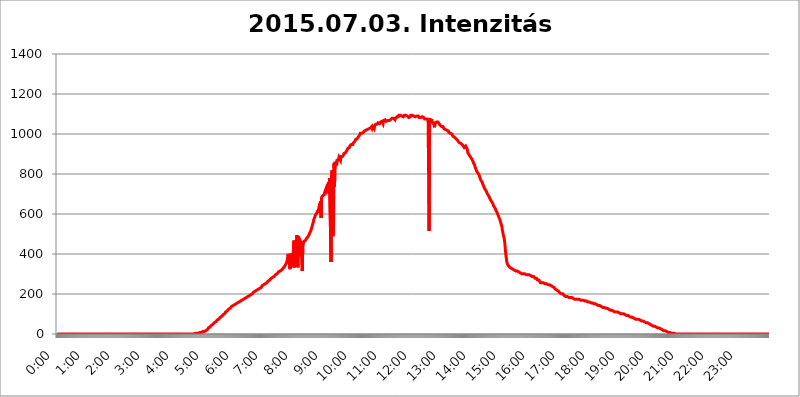
| Category | 2015.07.03. Intenzitás [W/m^2] |
|---|---|
| 0.0 | 0 |
| 0.0006944444444444445 | 0 |
| 0.001388888888888889 | 0 |
| 0.0020833333333333333 | 0 |
| 0.002777777777777778 | 0 |
| 0.003472222222222222 | 0 |
| 0.004166666666666667 | 0 |
| 0.004861111111111111 | 0 |
| 0.005555555555555556 | 0 |
| 0.0062499999999999995 | 0 |
| 0.006944444444444444 | 0 |
| 0.007638888888888889 | 0 |
| 0.008333333333333333 | 0 |
| 0.009027777777777779 | 0 |
| 0.009722222222222222 | 0 |
| 0.010416666666666666 | 0 |
| 0.011111111111111112 | 0 |
| 0.011805555555555555 | 0 |
| 0.012499999999999999 | 0 |
| 0.013194444444444444 | 0 |
| 0.013888888888888888 | 0 |
| 0.014583333333333332 | 0 |
| 0.015277777777777777 | 0 |
| 0.015972222222222224 | 0 |
| 0.016666666666666666 | 0 |
| 0.017361111111111112 | 0 |
| 0.018055555555555557 | 0 |
| 0.01875 | 0 |
| 0.019444444444444445 | 0 |
| 0.02013888888888889 | 0 |
| 0.020833333333333332 | 0 |
| 0.02152777777777778 | 0 |
| 0.022222222222222223 | 0 |
| 0.02291666666666667 | 0 |
| 0.02361111111111111 | 0 |
| 0.024305555555555556 | 0 |
| 0.024999999999999998 | 0 |
| 0.025694444444444447 | 0 |
| 0.02638888888888889 | 0 |
| 0.027083333333333334 | 0 |
| 0.027777777777777776 | 0 |
| 0.02847222222222222 | 0 |
| 0.029166666666666664 | 0 |
| 0.029861111111111113 | 0 |
| 0.030555555555555555 | 0 |
| 0.03125 | 0 |
| 0.03194444444444445 | 0 |
| 0.03263888888888889 | 0 |
| 0.03333333333333333 | 0 |
| 0.034027777777777775 | 0 |
| 0.034722222222222224 | 0 |
| 0.035416666666666666 | 0 |
| 0.036111111111111115 | 0 |
| 0.03680555555555556 | 0 |
| 0.0375 | 0 |
| 0.03819444444444444 | 0 |
| 0.03888888888888889 | 0 |
| 0.03958333333333333 | 0 |
| 0.04027777777777778 | 0 |
| 0.04097222222222222 | 0 |
| 0.041666666666666664 | 0 |
| 0.042361111111111106 | 0 |
| 0.04305555555555556 | 0 |
| 0.043750000000000004 | 0 |
| 0.044444444444444446 | 0 |
| 0.04513888888888889 | 0 |
| 0.04583333333333334 | 0 |
| 0.04652777777777778 | 0 |
| 0.04722222222222222 | 0 |
| 0.04791666666666666 | 0 |
| 0.04861111111111111 | 0 |
| 0.049305555555555554 | 0 |
| 0.049999999999999996 | 0 |
| 0.05069444444444445 | 0 |
| 0.051388888888888894 | 0 |
| 0.052083333333333336 | 0 |
| 0.05277777777777778 | 0 |
| 0.05347222222222222 | 0 |
| 0.05416666666666667 | 0 |
| 0.05486111111111111 | 0 |
| 0.05555555555555555 | 0 |
| 0.05625 | 0 |
| 0.05694444444444444 | 0 |
| 0.057638888888888885 | 0 |
| 0.05833333333333333 | 0 |
| 0.05902777777777778 | 0 |
| 0.059722222222222225 | 0 |
| 0.06041666666666667 | 0 |
| 0.061111111111111116 | 0 |
| 0.06180555555555556 | 0 |
| 0.0625 | 0 |
| 0.06319444444444444 | 0 |
| 0.06388888888888888 | 0 |
| 0.06458333333333334 | 0 |
| 0.06527777777777778 | 0 |
| 0.06597222222222222 | 0 |
| 0.06666666666666667 | 0 |
| 0.06736111111111111 | 0 |
| 0.06805555555555555 | 0 |
| 0.06874999999999999 | 0 |
| 0.06944444444444443 | 0 |
| 0.07013888888888889 | 0 |
| 0.07083333333333333 | 0 |
| 0.07152777777777779 | 0 |
| 0.07222222222222223 | 0 |
| 0.07291666666666667 | 0 |
| 0.07361111111111111 | 0 |
| 0.07430555555555556 | 0 |
| 0.075 | 0 |
| 0.07569444444444444 | 0 |
| 0.0763888888888889 | 0 |
| 0.07708333333333334 | 0 |
| 0.07777777777777778 | 0 |
| 0.07847222222222222 | 0 |
| 0.07916666666666666 | 0 |
| 0.0798611111111111 | 0 |
| 0.08055555555555556 | 0 |
| 0.08125 | 0 |
| 0.08194444444444444 | 0 |
| 0.08263888888888889 | 0 |
| 0.08333333333333333 | 0 |
| 0.08402777777777777 | 0 |
| 0.08472222222222221 | 0 |
| 0.08541666666666665 | 0 |
| 0.08611111111111112 | 0 |
| 0.08680555555555557 | 0 |
| 0.08750000000000001 | 0 |
| 0.08819444444444445 | 0 |
| 0.08888888888888889 | 0 |
| 0.08958333333333333 | 0 |
| 0.09027777777777778 | 0 |
| 0.09097222222222222 | 0 |
| 0.09166666666666667 | 0 |
| 0.09236111111111112 | 0 |
| 0.09305555555555556 | 0 |
| 0.09375 | 0 |
| 0.09444444444444444 | 0 |
| 0.09513888888888888 | 0 |
| 0.09583333333333333 | 0 |
| 0.09652777777777777 | 0 |
| 0.09722222222222222 | 0 |
| 0.09791666666666667 | 0 |
| 0.09861111111111111 | 0 |
| 0.09930555555555555 | 0 |
| 0.09999999999999999 | 0 |
| 0.10069444444444443 | 0 |
| 0.1013888888888889 | 0 |
| 0.10208333333333335 | 0 |
| 0.10277777777777779 | 0 |
| 0.10347222222222223 | 0 |
| 0.10416666666666667 | 0 |
| 0.10486111111111111 | 0 |
| 0.10555555555555556 | 0 |
| 0.10625 | 0 |
| 0.10694444444444444 | 0 |
| 0.1076388888888889 | 0 |
| 0.10833333333333334 | 0 |
| 0.10902777777777778 | 0 |
| 0.10972222222222222 | 0 |
| 0.1111111111111111 | 0 |
| 0.11180555555555556 | 0 |
| 0.11180555555555556 | 0 |
| 0.1125 | 0 |
| 0.11319444444444444 | 0 |
| 0.11388888888888889 | 0 |
| 0.11458333333333333 | 0 |
| 0.11527777777777777 | 0 |
| 0.11597222222222221 | 0 |
| 0.11666666666666665 | 0 |
| 0.1173611111111111 | 0 |
| 0.11805555555555557 | 0 |
| 0.11944444444444445 | 0 |
| 0.12013888888888889 | 0 |
| 0.12083333333333333 | 0 |
| 0.12152777777777778 | 0 |
| 0.12222222222222223 | 0 |
| 0.12291666666666667 | 0 |
| 0.12291666666666667 | 0 |
| 0.12361111111111112 | 0 |
| 0.12430555555555556 | 0 |
| 0.125 | 0 |
| 0.12569444444444444 | 0 |
| 0.12638888888888888 | 0 |
| 0.12708333333333333 | 0 |
| 0.16875 | 0 |
| 0.12847222222222224 | 0 |
| 0.12916666666666668 | 0 |
| 0.12986111111111112 | 0 |
| 0.13055555555555556 | 0 |
| 0.13125 | 0 |
| 0.13194444444444445 | 0 |
| 0.1326388888888889 | 0 |
| 0.13333333333333333 | 0 |
| 0.13402777777777777 | 0 |
| 0.13402777777777777 | 0 |
| 0.13472222222222222 | 0 |
| 0.13541666666666666 | 0 |
| 0.1361111111111111 | 0 |
| 0.13749999999999998 | 0 |
| 0.13819444444444443 | 0 |
| 0.1388888888888889 | 0 |
| 0.13958333333333334 | 0 |
| 0.14027777777777778 | 0 |
| 0.14097222222222222 | 0 |
| 0.14166666666666666 | 0 |
| 0.1423611111111111 | 0 |
| 0.14305555555555557 | 0 |
| 0.14375000000000002 | 0 |
| 0.14444444444444446 | 0 |
| 0.1451388888888889 | 0 |
| 0.1451388888888889 | 0 |
| 0.14652777777777778 | 0 |
| 0.14722222222222223 | 0 |
| 0.14791666666666667 | 0 |
| 0.1486111111111111 | 0 |
| 0.14930555555555555 | 0 |
| 0.15 | 0 |
| 0.15069444444444444 | 0 |
| 0.15138888888888888 | 0 |
| 0.15208333333333332 | 0 |
| 0.15277777777777776 | 0 |
| 0.15347222222222223 | 0 |
| 0.15416666666666667 | 0 |
| 0.15486111111111112 | 0 |
| 0.15555555555555556 | 0 |
| 0.15625 | 0 |
| 0.15694444444444444 | 0 |
| 0.15763888888888888 | 0 |
| 0.15833333333333333 | 0 |
| 0.15902777777777777 | 0 |
| 0.15972222222222224 | 0 |
| 0.16041666666666668 | 0 |
| 0.16111111111111112 | 0 |
| 0.16180555555555556 | 0 |
| 0.1625 | 0 |
| 0.16319444444444445 | 0 |
| 0.1638888888888889 | 0 |
| 0.16458333333333333 | 0 |
| 0.16527777777777777 | 0 |
| 0.16597222222222222 | 0 |
| 0.16666666666666666 | 0 |
| 0.1673611111111111 | 0 |
| 0.16805555555555554 | 0 |
| 0.16874999999999998 | 0 |
| 0.16944444444444443 | 0 |
| 0.17013888888888887 | 0 |
| 0.1708333333333333 | 0 |
| 0.17152777777777775 | 0 |
| 0.17222222222222225 | 0 |
| 0.1729166666666667 | 0 |
| 0.17361111111111113 | 0 |
| 0.17430555555555557 | 0 |
| 0.17500000000000002 | 0 |
| 0.17569444444444446 | 0 |
| 0.1763888888888889 | 0 |
| 0.17708333333333334 | 0 |
| 0.17777777777777778 | 0 |
| 0.17847222222222223 | 0 |
| 0.17916666666666667 | 0 |
| 0.1798611111111111 | 0 |
| 0.18055555555555555 | 0 |
| 0.18125 | 0 |
| 0.18194444444444444 | 0 |
| 0.1826388888888889 | 0 |
| 0.18333333333333335 | 0 |
| 0.1840277777777778 | 0 |
| 0.18472222222222223 | 0 |
| 0.18541666666666667 | 0 |
| 0.18611111111111112 | 0 |
| 0.18680555555555556 | 0 |
| 0.1875 | 0 |
| 0.18819444444444444 | 0 |
| 0.18888888888888888 | 0 |
| 0.18958333333333333 | 0 |
| 0.19027777777777777 | 0 |
| 0.1909722222222222 | 0 |
| 0.19166666666666665 | 0 |
| 0.19236111111111112 | 0 |
| 0.19305555555555554 | 0 |
| 0.19375 | 3.525 |
| 0.19444444444444445 | 3.525 |
| 0.1951388888888889 | 3.525 |
| 0.19583333333333333 | 3.525 |
| 0.19652777777777777 | 3.525 |
| 0.19722222222222222 | 3.525 |
| 0.19791666666666666 | 3.525 |
| 0.1986111111111111 | 3.525 |
| 0.19930555555555554 | 7.887 |
| 0.19999999999999998 | 7.887 |
| 0.20069444444444443 | 7.887 |
| 0.20138888888888887 | 7.887 |
| 0.2020833333333333 | 7.887 |
| 0.2027777777777778 | 7.887 |
| 0.2034722222222222 | 12.257 |
| 0.2041666666666667 | 12.257 |
| 0.20486111111111113 | 12.257 |
| 0.20555555555555557 | 12.257 |
| 0.20625000000000002 | 12.257 |
| 0.20694444444444446 | 16.636 |
| 0.2076388888888889 | 16.636 |
| 0.20833333333333334 | 16.636 |
| 0.20902777777777778 | 21.024 |
| 0.20972222222222223 | 21.024 |
| 0.21041666666666667 | 21.024 |
| 0.2111111111111111 | 25.419 |
| 0.21180555555555555 | 29.823 |
| 0.2125 | 29.823 |
| 0.21319444444444444 | 34.234 |
| 0.2138888888888889 | 34.234 |
| 0.21458333333333335 | 38.653 |
| 0.2152777777777778 | 38.653 |
| 0.21597222222222223 | 43.079 |
| 0.21666666666666667 | 43.079 |
| 0.21736111111111112 | 47.511 |
| 0.21805555555555556 | 47.511 |
| 0.21875 | 51.951 |
| 0.21944444444444444 | 51.951 |
| 0.22013888888888888 | 56.398 |
| 0.22083333333333333 | 56.398 |
| 0.22152777777777777 | 60.85 |
| 0.2222222222222222 | 60.85 |
| 0.22291666666666665 | 65.31 |
| 0.2236111111111111 | 65.31 |
| 0.22430555555555556 | 69.775 |
| 0.225 | 69.775 |
| 0.22569444444444445 | 74.246 |
| 0.2263888888888889 | 74.246 |
| 0.22708333333333333 | 78.722 |
| 0.22777777777777777 | 78.722 |
| 0.22847222222222222 | 83.205 |
| 0.22916666666666666 | 83.205 |
| 0.2298611111111111 | 87.692 |
| 0.23055555555555554 | 87.692 |
| 0.23124999999999998 | 92.184 |
| 0.23194444444444443 | 92.184 |
| 0.23263888888888887 | 96.682 |
| 0.2333333333333333 | 96.682 |
| 0.2340277777777778 | 101.184 |
| 0.2347222222222222 | 101.184 |
| 0.2354166666666667 | 105.69 |
| 0.23611111111111113 | 110.201 |
| 0.23680555555555557 | 110.201 |
| 0.23750000000000002 | 110.201 |
| 0.23819444444444446 | 114.716 |
| 0.2388888888888889 | 119.235 |
| 0.23958333333333334 | 119.235 |
| 0.24027777777777778 | 123.758 |
| 0.24097222222222223 | 123.758 |
| 0.24166666666666667 | 128.284 |
| 0.2423611111111111 | 128.284 |
| 0.24305555555555555 | 132.814 |
| 0.24375 | 132.814 |
| 0.24444444444444446 | 137.347 |
| 0.24513888888888888 | 137.347 |
| 0.24583333333333335 | 137.347 |
| 0.2465277777777778 | 141.884 |
| 0.24722222222222223 | 141.884 |
| 0.24791666666666667 | 141.884 |
| 0.24861111111111112 | 146.423 |
| 0.24930555555555556 | 146.423 |
| 0.25 | 150.964 |
| 0.25069444444444444 | 150.964 |
| 0.2513888888888889 | 155.509 |
| 0.2520833333333333 | 155.509 |
| 0.25277777777777777 | 155.509 |
| 0.2534722222222222 | 155.509 |
| 0.25416666666666665 | 160.056 |
| 0.2548611111111111 | 160.056 |
| 0.2555555555555556 | 164.605 |
| 0.25625000000000003 | 164.605 |
| 0.2569444444444445 | 164.605 |
| 0.2576388888888889 | 169.156 |
| 0.25833333333333336 | 169.156 |
| 0.2590277777777778 | 169.156 |
| 0.25972222222222224 | 173.709 |
| 0.2604166666666667 | 173.709 |
| 0.2611111111111111 | 173.709 |
| 0.26180555555555557 | 173.709 |
| 0.2625 | 178.264 |
| 0.26319444444444445 | 178.264 |
| 0.2638888888888889 | 178.264 |
| 0.26458333333333334 | 182.82 |
| 0.2652777777777778 | 182.82 |
| 0.2659722222222222 | 182.82 |
| 0.26666666666666666 | 187.378 |
| 0.2673611111111111 | 187.378 |
| 0.26805555555555555 | 191.937 |
| 0.26875 | 191.937 |
| 0.26944444444444443 | 191.937 |
| 0.2701388888888889 | 191.937 |
| 0.2708333333333333 | 196.497 |
| 0.27152777777777776 | 196.497 |
| 0.2722222222222222 | 201.058 |
| 0.27291666666666664 | 201.058 |
| 0.2736111111111111 | 201.058 |
| 0.2743055555555555 | 205.62 |
| 0.27499999999999997 | 205.62 |
| 0.27569444444444446 | 210.182 |
| 0.27638888888888885 | 210.182 |
| 0.27708333333333335 | 210.182 |
| 0.2777777777777778 | 214.746 |
| 0.27847222222222223 | 214.746 |
| 0.2791666666666667 | 219.309 |
| 0.2798611111111111 | 219.309 |
| 0.28055555555555556 | 219.309 |
| 0.28125 | 219.309 |
| 0.28194444444444444 | 223.873 |
| 0.2826388888888889 | 228.436 |
| 0.2833333333333333 | 228.436 |
| 0.28402777777777777 | 228.436 |
| 0.2847222222222222 | 228.436 |
| 0.28541666666666665 | 233 |
| 0.28611111111111115 | 233 |
| 0.28680555555555554 | 237.564 |
| 0.28750000000000003 | 242.127 |
| 0.2881944444444445 | 242.127 |
| 0.2888888888888889 | 242.127 |
| 0.28958333333333336 | 246.689 |
| 0.2902777777777778 | 246.689 |
| 0.29097222222222224 | 246.689 |
| 0.2916666666666667 | 251.251 |
| 0.2923611111111111 | 251.251 |
| 0.29305555555555557 | 255.813 |
| 0.29375 | 255.813 |
| 0.29444444444444445 | 260.373 |
| 0.2951388888888889 | 260.373 |
| 0.29583333333333334 | 264.932 |
| 0.2965277777777778 | 264.932 |
| 0.2972222222222222 | 269.49 |
| 0.29791666666666666 | 269.49 |
| 0.2986111111111111 | 269.49 |
| 0.29930555555555555 | 274.047 |
| 0.3 | 278.603 |
| 0.30069444444444443 | 278.603 |
| 0.3013888888888889 | 278.603 |
| 0.3020833333333333 | 283.156 |
| 0.30277777777777776 | 283.156 |
| 0.3034722222222222 | 287.709 |
| 0.30416666666666664 | 287.709 |
| 0.3048611111111111 | 292.259 |
| 0.3055555555555555 | 292.259 |
| 0.30624999999999997 | 296.808 |
| 0.3069444444444444 | 296.808 |
| 0.3076388888888889 | 301.354 |
| 0.30833333333333335 | 301.354 |
| 0.3090277777777778 | 305.898 |
| 0.30972222222222223 | 305.898 |
| 0.3104166666666667 | 310.44 |
| 0.3111111111111111 | 310.44 |
| 0.31180555555555556 | 314.98 |
| 0.3125 | 314.98 |
| 0.31319444444444444 | 314.98 |
| 0.3138888888888889 | 319.517 |
| 0.3145833333333333 | 319.517 |
| 0.31527777777777777 | 324.052 |
| 0.3159722222222222 | 324.052 |
| 0.31666666666666665 | 328.584 |
| 0.31736111111111115 | 328.584 |
| 0.31805555555555554 | 333.113 |
| 0.31875000000000003 | 337.639 |
| 0.3194444444444445 | 342.162 |
| 0.3201388888888889 | 346.682 |
| 0.32083333333333336 | 351.198 |
| 0.3215277777777778 | 355.712 |
| 0.32222222222222224 | 360.221 |
| 0.3229166666666667 | 373.729 |
| 0.3236111111111111 | 400.638 |
| 0.32430555555555557 | 396.164 |
| 0.325 | 387.202 |
| 0.32569444444444445 | 346.682 |
| 0.3263888888888889 | 324.052 |
| 0.32708333333333334 | 369.23 |
| 0.3277777777777778 | 333.113 |
| 0.3284722222222222 | 405.108 |
| 0.32916666666666666 | 355.712 |
| 0.3298611111111111 | 342.162 |
| 0.33055555555555555 | 373.729 |
| 0.33125 | 422.943 |
| 0.33194444444444443 | 467.187 |
| 0.3326388888888889 | 333.113 |
| 0.3333333333333333 | 333.113 |
| 0.3340277777777778 | 373.729 |
| 0.3347222222222222 | 351.198 |
| 0.3354166666666667 | 342.162 |
| 0.3361111111111111 | 493.475 |
| 0.3368055555555556 | 427.39 |
| 0.33749999999999997 | 333.113 |
| 0.33819444444444446 | 489.108 |
| 0.33888888888888885 | 391.685 |
| 0.33958333333333335 | 480.356 |
| 0.34027777777777773 | 475.972 |
| 0.34097222222222223 | 475.972 |
| 0.3416666666666666 | 445.129 |
| 0.3423611111111111 | 458.38 |
| 0.3430555555555555 | 458.38 |
| 0.34375 | 314.98 |
| 0.3444444444444445 | 462.786 |
| 0.3451388888888889 | 453.968 |
| 0.3458333333333334 | 462.786 |
| 0.34652777777777777 | 462.786 |
| 0.34722222222222227 | 467.187 |
| 0.34791666666666665 | 467.187 |
| 0.34861111111111115 | 471.582 |
| 0.34930555555555554 | 475.972 |
| 0.35000000000000003 | 475.972 |
| 0.3506944444444444 | 475.972 |
| 0.3513888888888889 | 484.735 |
| 0.3520833333333333 | 484.735 |
| 0.3527777777777778 | 493.475 |
| 0.3534722222222222 | 497.836 |
| 0.3541666666666667 | 506.542 |
| 0.3548611111111111 | 510.885 |
| 0.35555555555555557 | 515.223 |
| 0.35625 | 523.88 |
| 0.35694444444444445 | 532.513 |
| 0.3576388888888889 | 541.121 |
| 0.35833333333333334 | 549.704 |
| 0.3590277777777778 | 558.261 |
| 0.3597222222222222 | 571.049 |
| 0.36041666666666666 | 575.299 |
| 0.3611111111111111 | 583.779 |
| 0.36180555555555555 | 592.233 |
| 0.3625 | 592.233 |
| 0.36319444444444443 | 600.661 |
| 0.3638888888888889 | 600.661 |
| 0.3645833333333333 | 609.062 |
| 0.3652777777777778 | 617.436 |
| 0.3659722222222222 | 604.864 |
| 0.3666666666666667 | 625.784 |
| 0.3673611111111111 | 638.256 |
| 0.3680555555555556 | 650.667 |
| 0.36874999999999997 | 650.667 |
| 0.36944444444444446 | 663.019 |
| 0.37013888888888885 | 579.542 |
| 0.37083333333333335 | 683.473 |
| 0.37152777777777773 | 687.544 |
| 0.37222222222222223 | 691.608 |
| 0.3729166666666666 | 695.666 |
| 0.3736111111111111 | 695.666 |
| 0.3743055555555555 | 695.666 |
| 0.375 | 707.8 |
| 0.3756944444444445 | 703.762 |
| 0.3763888888888889 | 711.832 |
| 0.3770833333333334 | 727.896 |
| 0.37777777777777777 | 719.877 |
| 0.37847222222222227 | 715.858 |
| 0.37916666666666665 | 719.877 |
| 0.37986111111111115 | 751.803 |
| 0.38055555555555554 | 759.723 |
| 0.38125000000000003 | 703.762 |
| 0.3819444444444444 | 779.42 |
| 0.3826388888888889 | 775.492 |
| 0.3833333333333333 | 783.342 |
| 0.3840277777777778 | 360.221 |
| 0.3847222222222222 | 795.074 |
| 0.3854166666666667 | 818.392 |
| 0.3861111111111111 | 743.859 |
| 0.38680555555555557 | 489.108 |
| 0.3875 | 532.513 |
| 0.38819444444444445 | 853.029 |
| 0.3888888888888889 | 735.89 |
| 0.38958333333333334 | 860.676 |
| 0.3902777777777778 | 860.676 |
| 0.3909722222222222 | 860.676 |
| 0.39166666666666666 | 841.526 |
| 0.3923611111111111 | 868.305 |
| 0.39305555555555555 | 872.114 |
| 0.39375 | 868.305 |
| 0.39444444444444443 | 872.114 |
| 0.3951388888888889 | 883.516 |
| 0.3958333333333333 | 883.516 |
| 0.3965277777777778 | 879.719 |
| 0.3972222222222222 | 868.305 |
| 0.3979166666666667 | 887.309 |
| 0.3986111111111111 | 887.309 |
| 0.3993055555555556 | 891.099 |
| 0.39999999999999997 | 887.309 |
| 0.40069444444444446 | 887.309 |
| 0.40138888888888885 | 894.885 |
| 0.40208333333333335 | 902.447 |
| 0.40277777777777773 | 898.668 |
| 0.40347222222222223 | 902.447 |
| 0.4041666666666666 | 906.223 |
| 0.4048611111111111 | 902.447 |
| 0.4055555555555555 | 909.996 |
| 0.40625 | 917.534 |
| 0.4069444444444445 | 921.298 |
| 0.4076388888888889 | 928.819 |
| 0.4083333333333334 | 928.819 |
| 0.40902777777777777 | 928.819 |
| 0.40972222222222227 | 932.576 |
| 0.41041666666666665 | 940.082 |
| 0.41111111111111115 | 940.082 |
| 0.41180555555555554 | 940.082 |
| 0.41250000000000003 | 947.58 |
| 0.4131944444444444 | 947.58 |
| 0.4138888888888889 | 951.327 |
| 0.4145833333333333 | 947.58 |
| 0.4152777777777778 | 955.071 |
| 0.4159722222222222 | 958.814 |
| 0.4166666666666667 | 958.814 |
| 0.4173611111111111 | 962.555 |
| 0.41805555555555557 | 962.555 |
| 0.41875 | 973.772 |
| 0.41944444444444445 | 970.034 |
| 0.4201388888888889 | 977.508 |
| 0.42083333333333334 | 977.508 |
| 0.4215277777777778 | 981.244 |
| 0.4222222222222222 | 984.98 |
| 0.42291666666666666 | 988.714 |
| 0.4236111111111111 | 988.714 |
| 0.42430555555555555 | 996.182 |
| 0.425 | 1003.65 |
| 0.42569444444444443 | 1003.65 |
| 0.4263888888888889 | 1003.65 |
| 0.4270833333333333 | 1003.65 |
| 0.4277777777777778 | 1007.383 |
| 0.4284722222222222 | 1007.383 |
| 0.4291666666666667 | 1007.383 |
| 0.4298611111111111 | 1011.118 |
| 0.4305555555555556 | 1014.852 |
| 0.43124999999999997 | 1014.852 |
| 0.43194444444444446 | 1014.852 |
| 0.43263888888888885 | 1018.587 |
| 0.43333333333333335 | 1018.587 |
| 0.43402777777777773 | 1022.323 |
| 0.43472222222222223 | 1022.323 |
| 0.4354166666666666 | 1022.323 |
| 0.4361111111111111 | 1026.06 |
| 0.4368055555555555 | 1026.06 |
| 0.4375 | 1026.06 |
| 0.4381944444444445 | 1029.798 |
| 0.4388888888888889 | 1029.798 |
| 0.4395833333333334 | 1029.798 |
| 0.44027777777777777 | 1026.06 |
| 0.44097222222222227 | 1037.277 |
| 0.44166666666666665 | 1029.798 |
| 0.44236111111111115 | 1037.277 |
| 0.44305555555555554 | 1037.277 |
| 0.44375000000000003 | 1041.019 |
| 0.4444444444444444 | 1026.06 |
| 0.4451388888888889 | 1041.019 |
| 0.4458333333333333 | 1044.762 |
| 0.4465277777777778 | 1048.508 |
| 0.4472222222222222 | 1048.508 |
| 0.4479166666666667 | 1052.255 |
| 0.4486111111111111 | 1048.508 |
| 0.44930555555555557 | 1052.255 |
| 0.45 | 1056.004 |
| 0.45069444444444445 | 1052.255 |
| 0.4513888888888889 | 1059.756 |
| 0.45208333333333334 | 1052.255 |
| 0.4527777777777778 | 1052.255 |
| 0.4534722222222222 | 1059.756 |
| 0.45416666666666666 | 1059.756 |
| 0.4548611111111111 | 1063.51 |
| 0.45555555555555555 | 1063.51 |
| 0.45625 | 1063.51 |
| 0.45694444444444443 | 1052.255 |
| 0.4576388888888889 | 1067.267 |
| 0.4583333333333333 | 1067.267 |
| 0.4590277777777778 | 1071.027 |
| 0.4597222222222222 | 1071.027 |
| 0.4604166666666667 | 1071.027 |
| 0.4611111111111111 | 1063.51 |
| 0.4618055555555556 | 1067.267 |
| 0.46249999999999997 | 1067.267 |
| 0.46319444444444446 | 1067.267 |
| 0.46388888888888885 | 1063.51 |
| 0.46458333333333335 | 1067.267 |
| 0.46527777777777773 | 1067.267 |
| 0.46597222222222223 | 1067.267 |
| 0.4666666666666666 | 1067.267 |
| 0.4673611111111111 | 1071.027 |
| 0.4680555555555555 | 1074.789 |
| 0.46875 | 1067.267 |
| 0.4694444444444445 | 1078.555 |
| 0.4701388888888889 | 1078.555 |
| 0.4708333333333334 | 1078.555 |
| 0.47152777777777777 | 1078.555 |
| 0.47222222222222227 | 1078.555 |
| 0.47291666666666665 | 1082.324 |
| 0.47361111111111115 | 1071.027 |
| 0.47430555555555554 | 1078.555 |
| 0.47500000000000003 | 1082.324 |
| 0.4756944444444444 | 1082.324 |
| 0.4763888888888889 | 1086.097 |
| 0.4770833333333333 | 1086.097 |
| 0.4777777777777778 | 1086.097 |
| 0.4784722222222222 | 1086.097 |
| 0.4791666666666667 | 1093.653 |
| 0.4798611111111111 | 1093.653 |
| 0.48055555555555557 | 1093.653 |
| 0.48125 | 1093.653 |
| 0.48194444444444445 | 1093.653 |
| 0.4826388888888889 | 1093.653 |
| 0.48333333333333334 | 1089.873 |
| 0.4840277777777778 | 1086.097 |
| 0.4847222222222222 | 1086.097 |
| 0.48541666666666666 | 1086.097 |
| 0.4861111111111111 | 1086.097 |
| 0.48680555555555555 | 1093.653 |
| 0.4875 | 1093.653 |
| 0.48819444444444443 | 1097.437 |
| 0.4888888888888889 | 1093.653 |
| 0.4895833333333333 | 1093.653 |
| 0.4902777777777778 | 1093.653 |
| 0.4909722222222222 | 1089.873 |
| 0.4916666666666667 | 1089.873 |
| 0.4923611111111111 | 1086.097 |
| 0.4930555555555556 | 1082.324 |
| 0.49374999999999997 | 1082.324 |
| 0.49444444444444446 | 1082.324 |
| 0.49513888888888885 | 1086.097 |
| 0.49583333333333335 | 1093.653 |
| 0.49652777777777773 | 1097.437 |
| 0.49722222222222223 | 1093.653 |
| 0.4979166666666666 | 1093.653 |
| 0.4986111111111111 | 1093.653 |
| 0.4993055555555555 | 1089.873 |
| 0.5 | 1089.873 |
| 0.5006944444444444 | 1086.097 |
| 0.5013888888888889 | 1086.097 |
| 0.5020833333333333 | 1086.097 |
| 0.5027777777777778 | 1082.324 |
| 0.5034722222222222 | 1089.873 |
| 0.5041666666666667 | 1089.873 |
| 0.5048611111111111 | 1093.653 |
| 0.5055555555555555 | 1093.653 |
| 0.50625 | 1089.873 |
| 0.5069444444444444 | 1089.873 |
| 0.5076388888888889 | 1082.324 |
| 0.5083333333333333 | 1082.324 |
| 0.5090277777777777 | 1082.324 |
| 0.5097222222222222 | 1082.324 |
| 0.5104166666666666 | 1082.324 |
| 0.5111111111111112 | 1086.097 |
| 0.5118055555555555 | 1086.097 |
| 0.5125000000000001 | 1086.097 |
| 0.5131944444444444 | 1082.324 |
| 0.513888888888889 | 1082.324 |
| 0.5145833333333333 | 1078.555 |
| 0.5152777777777778 | 1074.789 |
| 0.5159722222222222 | 1074.789 |
| 0.5166666666666667 | 1074.789 |
| 0.517361111111111 | 1074.789 |
| 0.5180555555555556 | 1074.789 |
| 0.5187499999999999 | 1078.555 |
| 0.5194444444444445 | 1074.789 |
| 0.5201388888888888 | 1067.267 |
| 0.5208333333333334 | 818.392 |
| 0.5215277777777778 | 515.223 |
| 0.5222222222222223 | 1078.555 |
| 0.5229166666666667 | 1078.555 |
| 0.5236111111111111 | 1067.267 |
| 0.5243055555555556 | 1067.267 |
| 0.525 | 1067.267 |
| 0.5256944444444445 | 1067.267 |
| 0.5263888888888889 | 1056.004 |
| 0.5270833333333333 | 1059.756 |
| 0.5277777777777778 | 1056.004 |
| 0.5284722222222222 | 1048.508 |
| 0.5291666666666667 | 1033.537 |
| 0.5298611111111111 | 1056.004 |
| 0.5305555555555556 | 1059.756 |
| 0.53125 | 1059.756 |
| 0.5319444444444444 | 1059.756 |
| 0.5326388888888889 | 1059.756 |
| 0.5333333333333333 | 1056.004 |
| 0.5340277777777778 | 1059.756 |
| 0.5347222222222222 | 1056.004 |
| 0.5354166666666667 | 1052.255 |
| 0.5361111111111111 | 1048.508 |
| 0.5368055555555555 | 1044.762 |
| 0.5375 | 1041.019 |
| 0.5381944444444444 | 1041.019 |
| 0.5388888888888889 | 1037.277 |
| 0.5395833333333333 | 1037.277 |
| 0.5402777777777777 | 1041.019 |
| 0.5409722222222222 | 1037.277 |
| 0.5416666666666666 | 1033.537 |
| 0.5423611111111112 | 1026.06 |
| 0.5430555555555555 | 1022.323 |
| 0.5437500000000001 | 1022.323 |
| 0.5444444444444444 | 1022.323 |
| 0.545138888888889 | 1022.323 |
| 0.5458333333333333 | 1018.587 |
| 0.5465277777777778 | 1018.587 |
| 0.5472222222222222 | 1014.852 |
| 0.5479166666666667 | 1014.852 |
| 0.548611111111111 | 1014.852 |
| 0.5493055555555556 | 1007.383 |
| 0.5499999999999999 | 1007.383 |
| 0.5506944444444445 | 1007.383 |
| 0.5513888888888888 | 1003.65 |
| 0.5520833333333334 | 1003.65 |
| 0.5527777777777778 | 1007.383 |
| 0.5534722222222223 | 999.916 |
| 0.5541666666666667 | 996.182 |
| 0.5548611111111111 | 988.714 |
| 0.5555555555555556 | 988.714 |
| 0.55625 | 984.98 |
| 0.5569444444444445 | 984.98 |
| 0.5576388888888889 | 984.98 |
| 0.5583333333333333 | 984.98 |
| 0.5590277777777778 | 977.508 |
| 0.5597222222222222 | 981.244 |
| 0.5604166666666667 | 973.772 |
| 0.5611111111111111 | 970.034 |
| 0.5618055555555556 | 966.295 |
| 0.5625 | 962.555 |
| 0.5631944444444444 | 962.555 |
| 0.5638888888888889 | 962.555 |
| 0.5645833333333333 | 955.071 |
| 0.5652777777777778 | 955.071 |
| 0.5659722222222222 | 955.071 |
| 0.5666666666666667 | 951.327 |
| 0.5673611111111111 | 947.58 |
| 0.5680555555555555 | 947.58 |
| 0.56875 | 943.832 |
| 0.5694444444444444 | 943.832 |
| 0.5701388888888889 | 940.082 |
| 0.5708333333333333 | 932.576 |
| 0.5715277777777777 | 932.576 |
| 0.5722222222222222 | 936.33 |
| 0.5729166666666666 | 940.082 |
| 0.5736111111111112 | 940.082 |
| 0.5743055555555555 | 936.33 |
| 0.5750000000000001 | 925.06 |
| 0.5756944444444444 | 909.996 |
| 0.576388888888889 | 902.447 |
| 0.5770833333333333 | 898.668 |
| 0.5777777777777778 | 894.885 |
| 0.5784722222222222 | 898.668 |
| 0.5791666666666667 | 887.309 |
| 0.579861111111111 | 883.516 |
| 0.5805555555555556 | 879.719 |
| 0.5812499999999999 | 875.918 |
| 0.5819444444444445 | 872.114 |
| 0.5826388888888888 | 872.114 |
| 0.5833333333333334 | 860.676 |
| 0.5840277777777778 | 853.029 |
| 0.5847222222222223 | 849.199 |
| 0.5854166666666667 | 845.365 |
| 0.5861111111111111 | 833.834 |
| 0.5868055555555556 | 829.981 |
| 0.5875 | 822.26 |
| 0.5881944444444445 | 814.519 |
| 0.5888888888888889 | 814.519 |
| 0.5895833333333333 | 806.757 |
| 0.5902777777777778 | 802.868 |
| 0.5909722222222222 | 802.868 |
| 0.5916666666666667 | 795.074 |
| 0.5923611111111111 | 787.258 |
| 0.5930555555555556 | 779.42 |
| 0.59375 | 771.559 |
| 0.5944444444444444 | 771.559 |
| 0.5951388888888889 | 767.62 |
| 0.5958333333333333 | 759.723 |
| 0.5965277777777778 | 751.803 |
| 0.5972222222222222 | 747.834 |
| 0.5979166666666667 | 739.877 |
| 0.5986111111111111 | 735.89 |
| 0.5993055555555555 | 727.896 |
| 0.6 | 723.889 |
| 0.6006944444444444 | 719.877 |
| 0.6013888888888889 | 715.858 |
| 0.6020833333333333 | 711.832 |
| 0.6027777777777777 | 703.762 |
| 0.6034722222222222 | 699.717 |
| 0.6041666666666666 | 695.666 |
| 0.6048611111111112 | 691.608 |
| 0.6055555555555555 | 687.544 |
| 0.6062500000000001 | 683.473 |
| 0.6069444444444444 | 675.311 |
| 0.607638888888889 | 671.22 |
| 0.6083333333333333 | 667.123 |
| 0.6090277777777778 | 663.019 |
| 0.6097222222222222 | 658.909 |
| 0.6104166666666667 | 654.791 |
| 0.611111111111111 | 650.667 |
| 0.6118055555555556 | 642.4 |
| 0.6124999999999999 | 638.256 |
| 0.6131944444444445 | 634.105 |
| 0.6138888888888888 | 629.948 |
| 0.6145833333333334 | 625.784 |
| 0.6152777777777778 | 617.436 |
| 0.6159722222222223 | 613.252 |
| 0.6166666666666667 | 609.062 |
| 0.6173611111111111 | 604.864 |
| 0.6180555555555556 | 596.45 |
| 0.61875 | 592.233 |
| 0.6194444444444445 | 583.779 |
| 0.6201388888888889 | 579.542 |
| 0.6208333333333333 | 571.049 |
| 0.6215277777777778 | 562.53 |
| 0.6222222222222222 | 553.986 |
| 0.6229166666666667 | 549.704 |
| 0.6236111111111111 | 536.82 |
| 0.6243055555555556 | 519.555 |
| 0.625 | 506.542 |
| 0.6256944444444444 | 493.475 |
| 0.6263888888888889 | 484.735 |
| 0.6270833333333333 | 471.582 |
| 0.6277777777777778 | 453.968 |
| 0.6284722222222222 | 422.943 |
| 0.6291666666666667 | 396.164 |
| 0.6298611111111111 | 378.224 |
| 0.6305555555555555 | 360.221 |
| 0.63125 | 351.198 |
| 0.6319444444444444 | 346.682 |
| 0.6326388888888889 | 342.162 |
| 0.6333333333333333 | 337.639 |
| 0.6340277777777777 | 337.639 |
| 0.6347222222222222 | 333.113 |
| 0.6354166666666666 | 333.113 |
| 0.6361111111111112 | 328.584 |
| 0.6368055555555555 | 328.584 |
| 0.6375000000000001 | 328.584 |
| 0.6381944444444444 | 324.052 |
| 0.638888888888889 | 324.052 |
| 0.6395833333333333 | 324.052 |
| 0.6402777777777778 | 324.052 |
| 0.6409722222222222 | 319.517 |
| 0.6416666666666667 | 319.517 |
| 0.642361111111111 | 319.517 |
| 0.6430555555555556 | 314.98 |
| 0.6437499999999999 | 314.98 |
| 0.6444444444444445 | 314.98 |
| 0.6451388888888888 | 314.98 |
| 0.6458333333333334 | 314.98 |
| 0.6465277777777778 | 310.44 |
| 0.6472222222222223 | 310.44 |
| 0.6479166666666667 | 310.44 |
| 0.6486111111111111 | 305.898 |
| 0.6493055555555556 | 305.898 |
| 0.65 | 305.898 |
| 0.6506944444444445 | 305.898 |
| 0.6513888888888889 | 301.354 |
| 0.6520833333333333 | 305.898 |
| 0.6527777777777778 | 301.354 |
| 0.6534722222222222 | 301.354 |
| 0.6541666666666667 | 301.354 |
| 0.6548611111111111 | 301.354 |
| 0.6555555555555556 | 301.354 |
| 0.65625 | 296.808 |
| 0.6569444444444444 | 296.808 |
| 0.6576388888888889 | 296.808 |
| 0.6583333333333333 | 296.808 |
| 0.6590277777777778 | 296.808 |
| 0.6597222222222222 | 296.808 |
| 0.6604166666666667 | 292.259 |
| 0.6611111111111111 | 296.808 |
| 0.6618055555555555 | 296.808 |
| 0.6625 | 292.259 |
| 0.6631944444444444 | 292.259 |
| 0.6638888888888889 | 292.259 |
| 0.6645833333333333 | 292.259 |
| 0.6652777777777777 | 287.709 |
| 0.6659722222222222 | 287.709 |
| 0.6666666666666666 | 287.709 |
| 0.6673611111111111 | 287.709 |
| 0.6680555555555556 | 287.709 |
| 0.6687500000000001 | 283.156 |
| 0.6694444444444444 | 283.156 |
| 0.6701388888888888 | 278.603 |
| 0.6708333333333334 | 278.603 |
| 0.6715277777777778 | 278.603 |
| 0.6722222222222222 | 278.603 |
| 0.6729166666666666 | 274.047 |
| 0.6736111111111112 | 269.49 |
| 0.6743055555555556 | 274.047 |
| 0.6749999999999999 | 269.49 |
| 0.6756944444444444 | 269.49 |
| 0.6763888888888889 | 264.932 |
| 0.6770833333333334 | 264.932 |
| 0.6777777777777777 | 255.813 |
| 0.6784722222222223 | 255.813 |
| 0.6791666666666667 | 255.813 |
| 0.6798611111111111 | 255.813 |
| 0.6805555555555555 | 255.813 |
| 0.68125 | 255.813 |
| 0.6819444444444445 | 255.813 |
| 0.6826388888888889 | 255.813 |
| 0.6833333333333332 | 251.251 |
| 0.6840277777777778 | 251.251 |
| 0.6847222222222222 | 251.251 |
| 0.6854166666666667 | 251.251 |
| 0.686111111111111 | 251.251 |
| 0.6868055555555556 | 251.251 |
| 0.6875 | 251.251 |
| 0.6881944444444444 | 246.689 |
| 0.688888888888889 | 246.689 |
| 0.6895833333333333 | 246.689 |
| 0.6902777777777778 | 246.689 |
| 0.6909722222222222 | 242.127 |
| 0.6916666666666668 | 242.127 |
| 0.6923611111111111 | 242.127 |
| 0.6930555555555555 | 237.564 |
| 0.69375 | 237.564 |
| 0.6944444444444445 | 237.564 |
| 0.6951388888888889 | 233 |
| 0.6958333333333333 | 233 |
| 0.6965277777777777 | 233 |
| 0.6972222222222223 | 228.436 |
| 0.6979166666666666 | 228.436 |
| 0.6986111111111111 | 223.873 |
| 0.6993055555555556 | 223.873 |
| 0.7000000000000001 | 219.309 |
| 0.7006944444444444 | 219.309 |
| 0.7013888888888888 | 219.309 |
| 0.7020833333333334 | 214.746 |
| 0.7027777777777778 | 214.746 |
| 0.7034722222222222 | 210.182 |
| 0.7041666666666666 | 210.182 |
| 0.7048611111111112 | 205.62 |
| 0.7055555555555556 | 205.62 |
| 0.7062499999999999 | 205.62 |
| 0.7069444444444444 | 201.058 |
| 0.7076388888888889 | 201.058 |
| 0.7083333333333334 | 201.058 |
| 0.7090277777777777 | 201.058 |
| 0.7097222222222223 | 196.497 |
| 0.7104166666666667 | 196.497 |
| 0.7111111111111111 | 191.937 |
| 0.7118055555555555 | 191.937 |
| 0.7125 | 191.937 |
| 0.7131944444444445 | 187.378 |
| 0.7138888888888889 | 187.378 |
| 0.7145833333333332 | 187.378 |
| 0.7152777777777778 | 187.378 |
| 0.7159722222222222 | 182.82 |
| 0.7166666666666667 | 182.82 |
| 0.717361111111111 | 182.82 |
| 0.7180555555555556 | 182.82 |
| 0.71875 | 182.82 |
| 0.7194444444444444 | 182.82 |
| 0.720138888888889 | 182.82 |
| 0.7208333333333333 | 182.82 |
| 0.7215277777777778 | 182.82 |
| 0.7222222222222222 | 178.264 |
| 0.7229166666666668 | 178.264 |
| 0.7236111111111111 | 178.264 |
| 0.7243055555555555 | 178.264 |
| 0.725 | 178.264 |
| 0.7256944444444445 | 173.709 |
| 0.7263888888888889 | 173.709 |
| 0.7270833333333333 | 173.709 |
| 0.7277777777777777 | 173.709 |
| 0.7284722222222223 | 173.709 |
| 0.7291666666666666 | 173.709 |
| 0.7298611111111111 | 173.709 |
| 0.7305555555555556 | 173.709 |
| 0.7312500000000001 | 173.709 |
| 0.7319444444444444 | 173.709 |
| 0.7326388888888888 | 173.709 |
| 0.7333333333333334 | 169.156 |
| 0.7340277777777778 | 169.156 |
| 0.7347222222222222 | 169.156 |
| 0.7354166666666666 | 169.156 |
| 0.7361111111111112 | 169.156 |
| 0.7368055555555556 | 169.156 |
| 0.7374999999999999 | 164.605 |
| 0.7381944444444444 | 169.156 |
| 0.7388888888888889 | 169.156 |
| 0.7395833333333334 | 164.605 |
| 0.7402777777777777 | 164.605 |
| 0.7409722222222223 | 164.605 |
| 0.7416666666666667 | 164.605 |
| 0.7423611111111111 | 164.605 |
| 0.7430555555555555 | 164.605 |
| 0.74375 | 164.605 |
| 0.7444444444444445 | 160.056 |
| 0.7451388888888889 | 160.056 |
| 0.7458333333333332 | 160.056 |
| 0.7465277777777778 | 160.056 |
| 0.7472222222222222 | 160.056 |
| 0.7479166666666667 | 155.509 |
| 0.748611111111111 | 155.509 |
| 0.7493055555555556 | 155.509 |
| 0.75 | 155.509 |
| 0.7506944444444444 | 155.509 |
| 0.751388888888889 | 155.509 |
| 0.7520833333333333 | 150.964 |
| 0.7527777777777778 | 150.964 |
| 0.7534722222222222 | 150.964 |
| 0.7541666666666668 | 150.964 |
| 0.7548611111111111 | 150.964 |
| 0.7555555555555555 | 146.423 |
| 0.75625 | 146.423 |
| 0.7569444444444445 | 146.423 |
| 0.7576388888888889 | 146.423 |
| 0.7583333333333333 | 141.884 |
| 0.7590277777777777 | 141.884 |
| 0.7597222222222223 | 141.884 |
| 0.7604166666666666 | 141.884 |
| 0.7611111111111111 | 141.884 |
| 0.7618055555555556 | 137.347 |
| 0.7625000000000001 | 137.347 |
| 0.7631944444444444 | 137.347 |
| 0.7638888888888888 | 137.347 |
| 0.7645833333333334 | 137.347 |
| 0.7652777777777778 | 132.814 |
| 0.7659722222222222 | 132.814 |
| 0.7666666666666666 | 132.814 |
| 0.7673611111111112 | 132.814 |
| 0.7680555555555556 | 128.284 |
| 0.7687499999999999 | 128.284 |
| 0.7694444444444444 | 128.284 |
| 0.7701388888888889 | 128.284 |
| 0.7708333333333334 | 128.284 |
| 0.7715277777777777 | 128.284 |
| 0.7722222222222223 | 123.758 |
| 0.7729166666666667 | 123.758 |
| 0.7736111111111111 | 123.758 |
| 0.7743055555555555 | 123.758 |
| 0.775 | 119.235 |
| 0.7756944444444445 | 119.235 |
| 0.7763888888888889 | 119.235 |
| 0.7770833333333332 | 119.235 |
| 0.7777777777777778 | 119.235 |
| 0.7784722222222222 | 114.716 |
| 0.7791666666666667 | 114.716 |
| 0.779861111111111 | 114.716 |
| 0.7805555555555556 | 114.716 |
| 0.78125 | 110.201 |
| 0.7819444444444444 | 110.201 |
| 0.782638888888889 | 110.201 |
| 0.7833333333333333 | 110.201 |
| 0.7840277777777778 | 110.201 |
| 0.7847222222222222 | 110.201 |
| 0.7854166666666668 | 110.201 |
| 0.7861111111111111 | 110.201 |
| 0.7868055555555555 | 105.69 |
| 0.7875 | 105.69 |
| 0.7881944444444445 | 105.69 |
| 0.7888888888888889 | 105.69 |
| 0.7895833333333333 | 105.69 |
| 0.7902777777777777 | 101.184 |
| 0.7909722222222223 | 101.184 |
| 0.7916666666666666 | 101.184 |
| 0.7923611111111111 | 101.184 |
| 0.7930555555555556 | 101.184 |
| 0.7937500000000001 | 96.682 |
| 0.7944444444444444 | 101.184 |
| 0.7951388888888888 | 96.682 |
| 0.7958333333333334 | 96.682 |
| 0.7965277777777778 | 96.682 |
| 0.7972222222222222 | 92.184 |
| 0.7979166666666666 | 92.184 |
| 0.7986111111111112 | 92.184 |
| 0.7993055555555556 | 92.184 |
| 0.7999999999999999 | 92.184 |
| 0.8006944444444444 | 92.184 |
| 0.8013888888888889 | 87.692 |
| 0.8020833333333334 | 87.692 |
| 0.8027777777777777 | 87.692 |
| 0.8034722222222223 | 87.692 |
| 0.8041666666666667 | 83.205 |
| 0.8048611111111111 | 83.205 |
| 0.8055555555555555 | 83.205 |
| 0.80625 | 83.205 |
| 0.8069444444444445 | 83.205 |
| 0.8076388888888889 | 83.205 |
| 0.8083333333333332 | 78.722 |
| 0.8090277777777778 | 78.722 |
| 0.8097222222222222 | 78.722 |
| 0.8104166666666667 | 78.722 |
| 0.811111111111111 | 74.246 |
| 0.8118055555555556 | 74.246 |
| 0.8125 | 74.246 |
| 0.8131944444444444 | 74.246 |
| 0.813888888888889 | 74.246 |
| 0.8145833333333333 | 74.246 |
| 0.8152777777777778 | 74.246 |
| 0.8159722222222222 | 69.775 |
| 0.8166666666666668 | 69.775 |
| 0.8173611111111111 | 69.775 |
| 0.8180555555555555 | 69.775 |
| 0.81875 | 65.31 |
| 0.8194444444444445 | 65.31 |
| 0.8201388888888889 | 65.31 |
| 0.8208333333333333 | 65.31 |
| 0.8215277777777777 | 65.31 |
| 0.8222222222222223 | 65.31 |
| 0.8229166666666666 | 60.85 |
| 0.8236111111111111 | 60.85 |
| 0.8243055555555556 | 60.85 |
| 0.8250000000000001 | 60.85 |
| 0.8256944444444444 | 56.398 |
| 0.8263888888888888 | 56.398 |
| 0.8270833333333334 | 56.398 |
| 0.8277777777777778 | 56.398 |
| 0.8284722222222222 | 51.951 |
| 0.8291666666666666 | 51.951 |
| 0.8298611111111112 | 51.951 |
| 0.8305555555555556 | 47.511 |
| 0.8312499999999999 | 47.511 |
| 0.8319444444444444 | 47.511 |
| 0.8326388888888889 | 47.511 |
| 0.8333333333333334 | 47.511 |
| 0.8340277777777777 | 43.079 |
| 0.8347222222222223 | 43.079 |
| 0.8354166666666667 | 43.079 |
| 0.8361111111111111 | 38.653 |
| 0.8368055555555555 | 38.653 |
| 0.8375 | 38.653 |
| 0.8381944444444445 | 38.653 |
| 0.8388888888888889 | 38.653 |
| 0.8395833333333332 | 38.653 |
| 0.8402777777777778 | 34.234 |
| 0.8409722222222222 | 34.234 |
| 0.8416666666666667 | 34.234 |
| 0.842361111111111 | 29.823 |
| 0.8430555555555556 | 29.823 |
| 0.84375 | 29.823 |
| 0.8444444444444444 | 29.823 |
| 0.845138888888889 | 25.419 |
| 0.8458333333333333 | 25.419 |
| 0.8465277777777778 | 25.419 |
| 0.8472222222222222 | 21.024 |
| 0.8479166666666668 | 21.024 |
| 0.8486111111111111 | 21.024 |
| 0.8493055555555555 | 21.024 |
| 0.85 | 21.024 |
| 0.8506944444444445 | 16.636 |
| 0.8513888888888889 | 16.636 |
| 0.8520833333333333 | 16.636 |
| 0.8527777777777777 | 16.636 |
| 0.8534722222222223 | 12.257 |
| 0.8541666666666666 | 12.257 |
| 0.8548611111111111 | 12.257 |
| 0.8555555555555556 | 12.257 |
| 0.8562500000000001 | 12.257 |
| 0.8569444444444444 | 7.887 |
| 0.8576388888888888 | 7.887 |
| 0.8583333333333334 | 7.887 |
| 0.8590277777777778 | 7.887 |
| 0.8597222222222222 | 3.525 |
| 0.8604166666666666 | 3.525 |
| 0.8611111111111112 | 3.525 |
| 0.8618055555555556 | 3.525 |
| 0.8624999999999999 | 3.525 |
| 0.8631944444444444 | 3.525 |
| 0.8638888888888889 | 3.525 |
| 0.8645833333333334 | 3.525 |
| 0.8652777777777777 | 3.525 |
| 0.8659722222222223 | 0 |
| 0.8666666666666667 | 0 |
| 0.8673611111111111 | 0 |
| 0.8680555555555555 | 0 |
| 0.86875 | 0 |
| 0.8694444444444445 | 0 |
| 0.8701388888888889 | 0 |
| 0.8708333333333332 | 0 |
| 0.8715277777777778 | 0 |
| 0.8722222222222222 | 0 |
| 0.8729166666666667 | 0 |
| 0.873611111111111 | 0 |
| 0.8743055555555556 | 0 |
| 0.875 | 0 |
| 0.8756944444444444 | 0 |
| 0.876388888888889 | 0 |
| 0.8770833333333333 | 0 |
| 0.8777777777777778 | 0 |
| 0.8784722222222222 | 0 |
| 0.8791666666666668 | 0 |
| 0.8798611111111111 | 0 |
| 0.8805555555555555 | 0 |
| 0.88125 | 0 |
| 0.8819444444444445 | 0 |
| 0.8826388888888889 | 0 |
| 0.8833333333333333 | 0 |
| 0.8840277777777777 | 0 |
| 0.8847222222222223 | 0 |
| 0.8854166666666666 | 0 |
| 0.8861111111111111 | 0 |
| 0.8868055555555556 | 0 |
| 0.8875000000000001 | 0 |
| 0.8881944444444444 | 0 |
| 0.8888888888888888 | 0 |
| 0.8895833333333334 | 0 |
| 0.8902777777777778 | 0 |
| 0.8909722222222222 | 0 |
| 0.8916666666666666 | 0 |
| 0.8923611111111112 | 0 |
| 0.8930555555555556 | 0 |
| 0.8937499999999999 | 0 |
| 0.8944444444444444 | 0 |
| 0.8951388888888889 | 0 |
| 0.8958333333333334 | 0 |
| 0.8965277777777777 | 0 |
| 0.8972222222222223 | 0 |
| 0.8979166666666667 | 0 |
| 0.8986111111111111 | 0 |
| 0.8993055555555555 | 0 |
| 0.9 | 0 |
| 0.9006944444444445 | 0 |
| 0.9013888888888889 | 0 |
| 0.9020833333333332 | 0 |
| 0.9027777777777778 | 0 |
| 0.9034722222222222 | 0 |
| 0.9041666666666667 | 0 |
| 0.904861111111111 | 0 |
| 0.9055555555555556 | 0 |
| 0.90625 | 0 |
| 0.9069444444444444 | 0 |
| 0.907638888888889 | 0 |
| 0.9083333333333333 | 0 |
| 0.9090277777777778 | 0 |
| 0.9097222222222222 | 0 |
| 0.9104166666666668 | 0 |
| 0.9111111111111111 | 0 |
| 0.9118055555555555 | 0 |
| 0.9125 | 0 |
| 0.9131944444444445 | 0 |
| 0.9138888888888889 | 0 |
| 0.9145833333333333 | 0 |
| 0.9152777777777777 | 0 |
| 0.9159722222222223 | 0 |
| 0.9166666666666666 | 0 |
| 0.9173611111111111 | 0 |
| 0.9180555555555556 | 0 |
| 0.9187500000000001 | 0 |
| 0.9194444444444444 | 0 |
| 0.9201388888888888 | 0 |
| 0.9208333333333334 | 0 |
| 0.9215277777777778 | 0 |
| 0.9222222222222222 | 0 |
| 0.9229166666666666 | 0 |
| 0.9236111111111112 | 0 |
| 0.9243055555555556 | 0 |
| 0.9249999999999999 | 0 |
| 0.9256944444444444 | 0 |
| 0.9263888888888889 | 0 |
| 0.9270833333333334 | 0 |
| 0.9277777777777777 | 0 |
| 0.9284722222222223 | 0 |
| 0.9291666666666667 | 0 |
| 0.9298611111111111 | 0 |
| 0.9305555555555555 | 0 |
| 0.93125 | 0 |
| 0.9319444444444445 | 0 |
| 0.9326388888888889 | 0 |
| 0.9333333333333332 | 0 |
| 0.9340277777777778 | 0 |
| 0.9347222222222222 | 0 |
| 0.9354166666666667 | 0 |
| 0.936111111111111 | 0 |
| 0.9368055555555556 | 0 |
| 0.9375 | 0 |
| 0.9381944444444444 | 0 |
| 0.938888888888889 | 0 |
| 0.9395833333333333 | 0 |
| 0.9402777777777778 | 0 |
| 0.9409722222222222 | 0 |
| 0.9416666666666668 | 0 |
| 0.9423611111111111 | 0 |
| 0.9430555555555555 | 0 |
| 0.94375 | 0 |
| 0.9444444444444445 | 0 |
| 0.9451388888888889 | 0 |
| 0.9458333333333333 | 0 |
| 0.9465277777777777 | 0 |
| 0.9472222222222223 | 0 |
| 0.9479166666666666 | 0 |
| 0.9486111111111111 | 0 |
| 0.9493055555555556 | 0 |
| 0.9500000000000001 | 0 |
| 0.9506944444444444 | 0 |
| 0.9513888888888888 | 0 |
| 0.9520833333333334 | 0 |
| 0.9527777777777778 | 0 |
| 0.9534722222222222 | 0 |
| 0.9541666666666666 | 0 |
| 0.9548611111111112 | 0 |
| 0.9555555555555556 | 0 |
| 0.9562499999999999 | 0 |
| 0.9569444444444444 | 0 |
| 0.9576388888888889 | 0 |
| 0.9583333333333334 | 0 |
| 0.9590277777777777 | 0 |
| 0.9597222222222223 | 0 |
| 0.9604166666666667 | 0 |
| 0.9611111111111111 | 0 |
| 0.9618055555555555 | 0 |
| 0.9625 | 0 |
| 0.9631944444444445 | 0 |
| 0.9638888888888889 | 0 |
| 0.9645833333333332 | 0 |
| 0.9652777777777778 | 0 |
| 0.9659722222222222 | 0 |
| 0.9666666666666667 | 0 |
| 0.967361111111111 | 0 |
| 0.9680555555555556 | 0 |
| 0.96875 | 0 |
| 0.9694444444444444 | 0 |
| 0.970138888888889 | 0 |
| 0.9708333333333333 | 0 |
| 0.9715277777777778 | 0 |
| 0.9722222222222222 | 0 |
| 0.9729166666666668 | 0 |
| 0.9736111111111111 | 0 |
| 0.9743055555555555 | 0 |
| 0.975 | 0 |
| 0.9756944444444445 | 0 |
| 0.9763888888888889 | 0 |
| 0.9770833333333333 | 0 |
| 0.9777777777777777 | 0 |
| 0.9784722222222223 | 0 |
| 0.9791666666666666 | 0 |
| 0.9798611111111111 | 0 |
| 0.9805555555555556 | 0 |
| 0.9812500000000001 | 0 |
| 0.9819444444444444 | 0 |
| 0.9826388888888888 | 0 |
| 0.9833333333333334 | 0 |
| 0.9840277777777778 | 0 |
| 0.9847222222222222 | 0 |
| 0.9854166666666666 | 0 |
| 0.9861111111111112 | 0 |
| 0.9868055555555556 | 0 |
| 0.9874999999999999 | 0 |
| 0.9881944444444444 | 0 |
| 0.9888888888888889 | 0 |
| 0.9895833333333334 | 0 |
| 0.9902777777777777 | 0 |
| 0.9909722222222223 | 0 |
| 0.9916666666666667 | 0 |
| 0.9923611111111111 | 0 |
| 0.9930555555555555 | 0 |
| 0.99375 | 0 |
| 0.9944444444444445 | 0 |
| 0.9951388888888889 | 0 |
| 0.9958333333333332 | 0 |
| 0.9965277777777778 | 0 |
| 0.9972222222222222 | 0 |
| 0.9979166666666667 | 0 |
| 0.998611111111111 | 0 |
| 0.9993055555555556 | 0 |